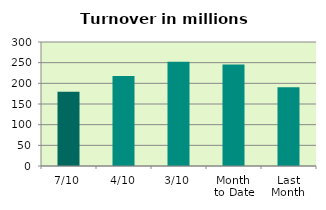
| Category | Series 0 |
|---|---|
| 7/10 | 179.856 |
| 4/10 | 217.781 |
| 3/10 | 252.221 |
| Month 
to Date | 245.672 |
| Last
Month | 190.73 |